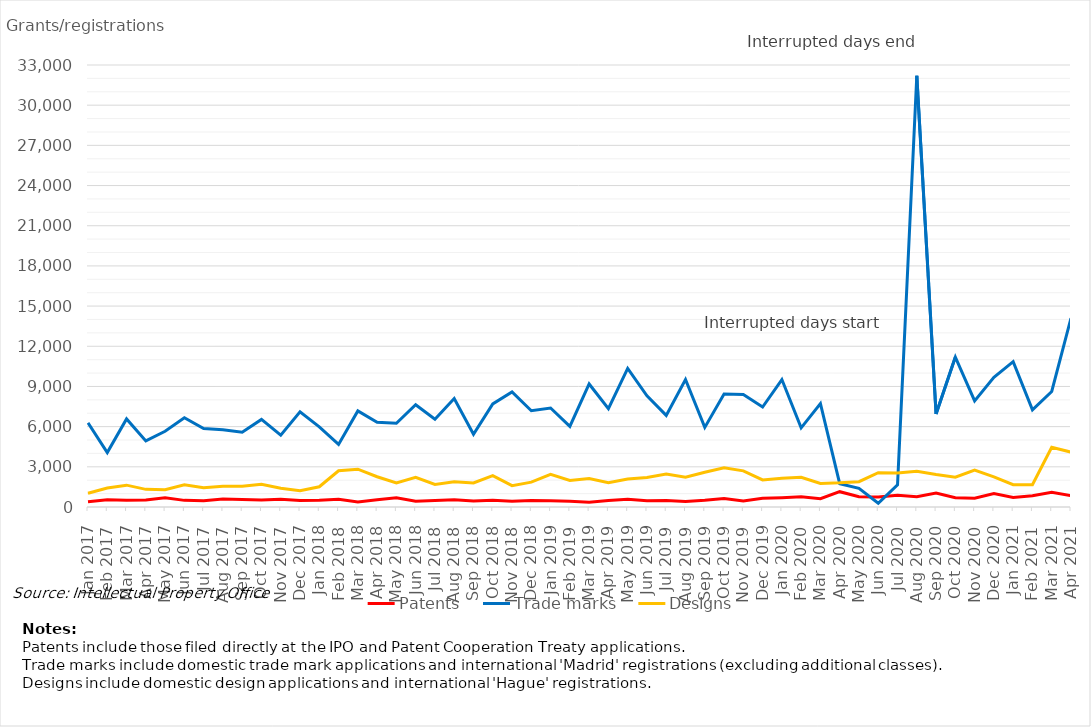
| Category | Patents | Trade marks | Designs |
|---|---|---|---|
| Jan 2017 | 387 | 6288 | 1026 |
| Feb 2017 | 533 | 4063 | 1420 |
| Mar 2017 | 505 | 6576 | 1631 |
| Apr 2017 | 516 | 4937 | 1318 |
| May 2017 | 681 | 5651 | 1284 |
| Jun 2017 | 495 | 6659 | 1660 |
| Jul 2017 | 466 | 5857 | 1437 |
| Aug 2017 | 592 | 5763 | 1550 |
| Sep 2017 | 554 | 5578 | 1553 |
| Oct 2017 | 517 | 6539 | 1705 |
| Nov 2017 | 578 | 5364 | 1397 |
| Dec 2017 | 487 | 7101 | 1218 |
| Jan 2018 | 495 | 5978 | 1512 |
| Feb 2018 | 574 | 4670 | 2704 |
| Mar 2018 | 370 | 7176 | 2825 |
| Apr 2018 | 543 | 6332 | 2259 |
| May 2018 | 690 | 6251 | 1789 |
| Jun 2018 | 424 | 7636 | 2222 |
| Jul 2018 | 486 | 6547 | 1678 |
| Aug 2018 | 536 | 8103 | 1878 |
| Sep 2018 | 450 | 5426 | 1795 |
| Oct 2018 | 498 | 7699 | 2348 |
| Nov 2018 | 432 | 8591 | 1592 |
| Dec 2018 | 484 | 7189 | 1859 |
| Jan 2019 | 475 | 7393 | 2444 |
| Feb 2019 | 426 | 6021 | 1987 |
| Mar 2019 | 363 | 9184 | 2125 |
| Apr 2019 | 488 | 7335 | 1810 |
| May 2019 | 573 | 10345 | 2096 |
| Jun 2019 | 471 | 8304 | 2202 |
| Jul 2019 | 489 | 6839 | 2464 |
| Aug 2019 | 420 | 9515 | 2218 |
| Sep 2019 | 500 | 5942 | 2596 |
| Oct 2019 | 634 | 8436 | 2926 |
| Nov 2019 | 455 | 8398 | 2700 |
| Dec 2019 | 654 | 7465 | 2021 |
| Jan 2020 | 696 | 9517 | 2145 |
| Feb 2020 | 756 | 5905 | 2220 |
| Mar 2020 | 622 | 7719 | 1758 |
| Apr 2020 | 1143 | 1741 | 1803 |
| May 2020 | 768 | 1398 | 1888 |
| Jun 2020 | 740 | 280 | 2564 |
| Jul 2020 | 878 | 1657 | 2539 |
| Aug 2020 | 771 | 32198 | 2665 |
| Sep 2020 | 1042 | 6941 | 2425 |
| Oct 2020 | 697 | 11197 | 2223 |
| Nov 2020 | 649 | 7926 | 2763 |
| Dec 2020 | 1010 | 9680 | 2252 |
| Jan 2021 | 708 | 10856 | 1665 |
| Feb 2021 | 838 | 7254 | 1661 |
| Mar 2021 | 1107 | 8626 | 4453 |
| Apr 2021 | 838 | 14099 | 4098 |